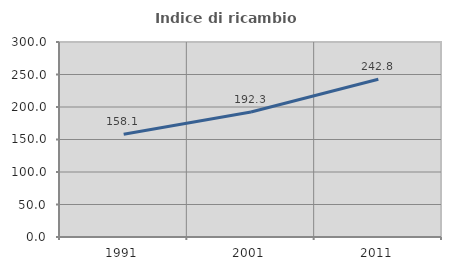
| Category | Indice di ricambio occupazionale  |
|---|---|
| 1991.0 | 158.084 |
| 2001.0 | 192.308 |
| 2011.0 | 242.771 |